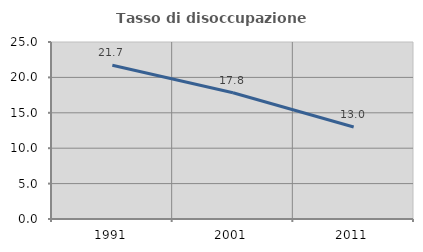
| Category | Tasso di disoccupazione giovanile  |
|---|---|
| 1991.0 | 21.714 |
| 2001.0 | 17.829 |
| 2011.0 | 13 |